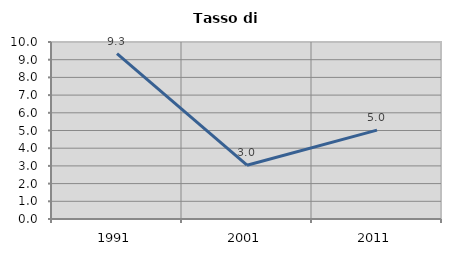
| Category | Tasso di disoccupazione   |
|---|---|
| 1991.0 | 9.343 |
| 2001.0 | 3.039 |
| 2011.0 | 5.02 |